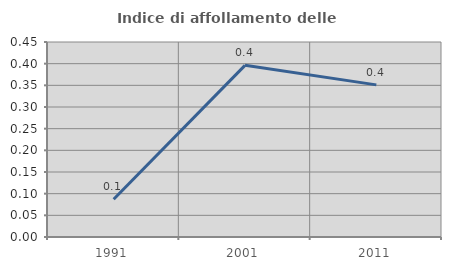
| Category | Indice di affollamento delle abitazioni  |
|---|---|
| 1991.0 | 0.087 |
| 2001.0 | 0.396 |
| 2011.0 | 0.351 |